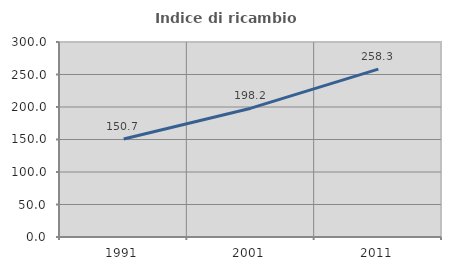
| Category | Indice di ricambio occupazionale  |
|---|---|
| 1991.0 | 150.655 |
| 2001.0 | 198.19 |
| 2011.0 | 258.289 |